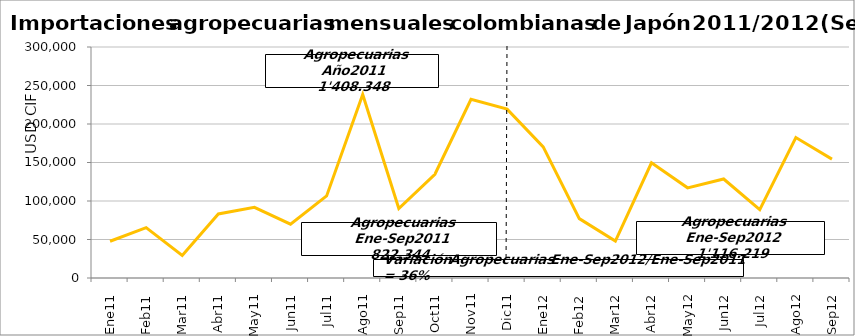
| Category | Agropecuarias |
|---|---|
| 0 | 47759.13 |
| 1 | 65354.24 |
| 2 | 29182.36 |
| 3 | 83201.8 |
| 4 | 91749.04 |
| 5 | 69919.45 |
| 6 | 106621.64 |
| 7 | 238293.88 |
| 8 | 90262.62 |
| 9 | 134760.13 |
| 10 | 231969.35 |
| 11 | 219274.75 |
| 12 | 170310.1 |
| 13 | 77130.72 |
| 14 | 47914.97 |
| 15 | 149520.07 |
| 16 | 117097.29 |
| 17 | 128588.97 |
| 18 | 88893.76 |
| 19 | 182369.48 |
| 20 | 154393.26 |